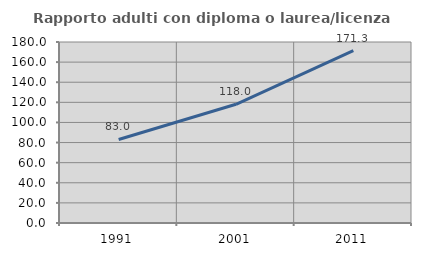
| Category | Rapporto adulti con diploma o laurea/licenza media  |
|---|---|
| 1991.0 | 83.049 |
| 2001.0 | 118.046 |
| 2011.0 | 171.347 |